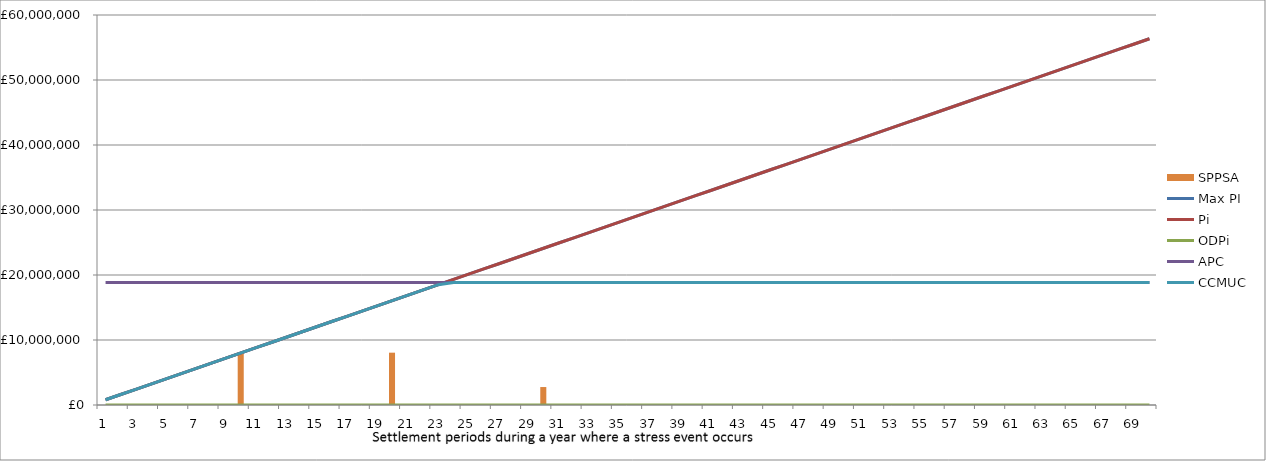
| Category | SPPSA |
|---|---|
| 0 | 0 |
| 1 | 0 |
| 2 | 0 |
| 3 | 0 |
| 4 | 0 |
| 5 | 0 |
| 6 | 0 |
| 7 | 0 |
| 8 | 0 |
| 9 | 8050000 |
| 10 | 0 |
| 11 | 0 |
| 12 | 0 |
| 13 | 0 |
| 14 | 0 |
| 15 | 0 |
| 16 | 0 |
| 17 | 0 |
| 18 | 0 |
| 19 | 8050000 |
| 20 | 0 |
| 21 | 0 |
| 22 | 0 |
| 23 | 0 |
| 24 | 0 |
| 25 | 0 |
| 26 | 0 |
| 27 | 0 |
| 28 | 0 |
| 29 | 2762760 |
| 30 | 0 |
| 31 | 0 |
| 32 | 0 |
| 33 | 0 |
| 34 | 0 |
| 35 | 0 |
| 36 | 0 |
| 37 | 0 |
| 38 | 0 |
| 39 | 0 |
| 40 | 0 |
| 41 | 0 |
| 42 | 0 |
| 43 | 0 |
| 44 | 0 |
| 45 | 0 |
| 46 | 0 |
| 47 | 0 |
| 48 | 0 |
| 49 | 0 |
| 50 | 0 |
| 51 | 0 |
| 52 | 0 |
| 53 | 0 |
| 54 | 0 |
| 55 | 0 |
| 56 | 0 |
| 57 | 0 |
| 58 | 0 |
| 59 | 0 |
| 60 | 0 |
| 61 | 0 |
| 62 | 0 |
| 63 | 0 |
| 64 | 0 |
| 65 | 0 |
| 66 | 0 |
| 67 | 0 |
| 68 | 0 |
| 69 | 0 |